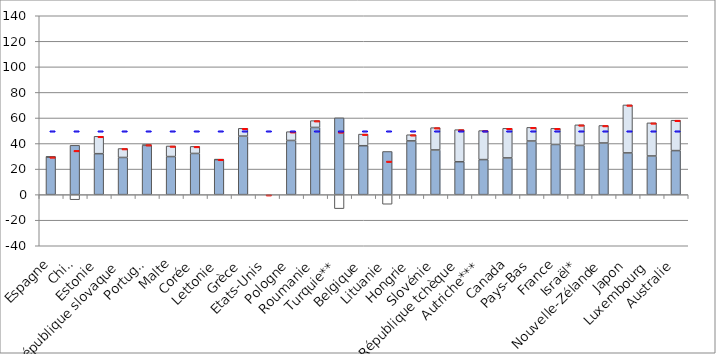
| Category | Revenus brut | Impôts nets | Transferts nets |
|---|---|---|---|
| Espagne | 29.549 | 0 | 0.018 |
| Chili | 38.598 | -3.962 | 0 |
| Estonie | 32.07 | 0 | 13.596 |
| République slovaque | 29.094 | 0 | 7.012 |
| Portugal | 38.561 | 0 | 0.542 |
| Malte | 29.81 | 0 | 8.275 |
| Corée | 32.242 | 0 | 5.52 |
| Lettonie | 27.432 | 0 | 0.24 |
| Grèce | 45.808 | 0 | 6.109 |
| Etats-Unis | 0 | 0 | 0 |
| Pologne | 42.395 | 0 | 6.887 |
| Roumanie | 52.601 | 0 | 5.33 |
| Turquie** | 60.112 | -10.953 | 0 |
| Belgique | 38.286 | 0 | 9.094 |
| Lituanie | 33.78 | -7.52 | 0 |
| Hongrie | 42.076 | 0 | 4.815 |
| Slovénie | 34.978 | 0 | 17.445 |
| République tchèque | 25.755 | 0 | 25.111 |
| Autriche*** | 27.428 | 0 | 22.696 |
| Canada | 28.749 | 0 | 23.173 |
| Pays-Bas | 41.996 | 0 | 10.647 |
| France | 39.283 | 0 | 12.606 |
| Israël* | 38.533 | 0 | 16.09 |
| Nouvelle-Zélande | 40.433 | 0 | 13.689 |
| Japon | 32.68 | 0 | 37.532 |
| Luxembourg | 30.282 | 0 | 25.895 |
| Australie | 34.477 | 0 | 23.789 |